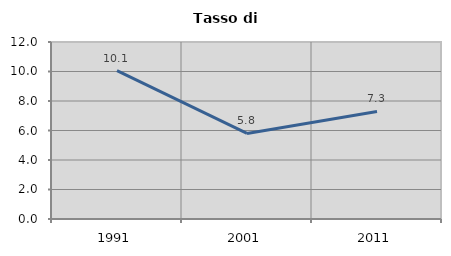
| Category | Tasso di disoccupazione   |
|---|---|
| 1991.0 | 10.064 |
| 2001.0 | 5.802 |
| 2011.0 | 7.291 |